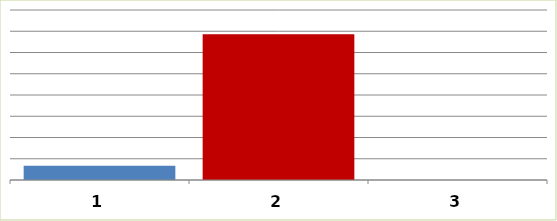
| Category | Series 0 |
|---|---|
| 0 | 3337100 |
| 1 | 34281231 |
| 2 | 0 |